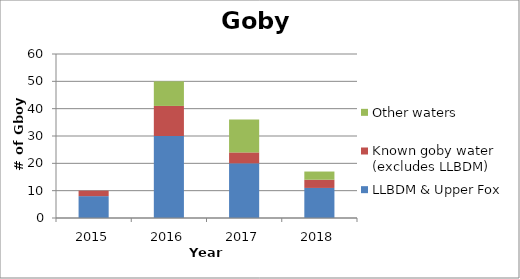
| Category | LLBDM & Upper Fox | Known goby water (excludes LLBDM) | Other waters |
|---|---|---|---|
| 2015.0 | 8 | 2 | 0 |
| 2016.0 | 30 | 11 | 9 |
| 2017.0 | 20 | 4 | 12 |
| 2018.0 | 11 | 3 | 3 |